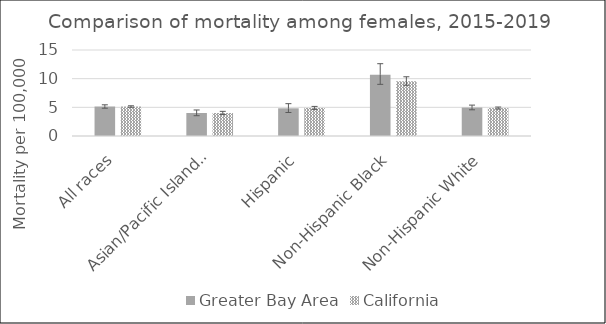
| Category | Greater Bay Area | California | US Mortality |
|---|---|---|---|
| All races | 5.14 | 5.14 |  |
| Asian/Pacific Islander | 4.01 | 4.01 |  |
| Hispanic | 4.83 | 4.9 |  |
| Non-Hispanic Black | 10.69 | 9.57 |  |
| Non-Hispanic White | 4.96 | 4.87 |  |